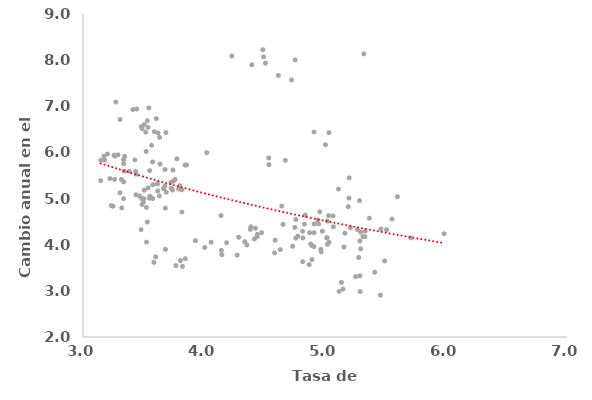
| Category | Cambio anual en el salario |
|---|---|
| 3.636755075451 | 5.747 |
| 3.551407384229 | 5.607 |
| 3.632562846344 | 6.326 |
| 3.566520086992 | 6.155 |
| 3.677917685002 | 5.63 |
| 3.743498910418 | 5.619 |
| 3.575231893725 | 5.793 |
| 3.434788330244 | 5.587 |
| 3.340362617098 | 5.595 |
| 3.260734633069 | 5.416 |
| 3.147302571141 | 5.831 |
| 3.173327092904 | 5.917 |
| 3.202334785867 | 5.964 |
| 3.5218073054139998 | 6.021 |
| 3.335968550554 | 5.363 |
| 3.382289959599 | 5.59 |
| 3.146376340557 | 5.388 |
| 3.506269509183 | 5.182 |
| 3.66525914218 | 5.215 |
| 3.616748951211 | 5.321 |
| 3.727625757521 | 5.353 |
| 3.677396772077 | 5.275 |
| 3.739330443662 | 5.183 |
| 3.790183583541 | 5.207 |
| 3.730108997 | 5.223 |
| 3.816746826182 | 5.189 |
| 3.80054906403 | 5.279 |
| 3.688204571884 | 5.136 |
| 3.465787348674 | 5.055 |
| 3.538455583808 | 5.232 |
| 3.487016914085 | 4.997 |
| 3.576317514046 | 5.001 |
| 3.503364823922 | 4.997 |
| 3.631091459426 | 5.056 |
| 3.55324857923 | 5.052 |
| 3.524255259055 | 4.808 |
| 3.817062512455 | 4.707 |
| 3.680310339228 | 4.791 |
| 3.760275125427 | 5.414 |
| 3.617664159624 | 5.164 |
| 3.576600983859 | 5.3 |
| 3.611667298808 | 5.321 |
| 3.843556222457 | 5.725 |
| 3.776113797965 | 5.862 |
| 3.855476447178 | 5.729 |
| 4.023080548475 | 5.996 |
| 4.536740523036 | 5.735 |
| 4.534791293367 | 5.879 |
| 4.671996861529 | 5.829 |
| 5.003211615659 | 6.168 |
| 4.956673154601 | 4.714 |
| 5.19811802376 | 5.009 |
| 5.598531370192 | 5.04 |
| 5.285655679778 | 4.957 |
| 5.462130923632 | 4.338 |
| 5.709113210652 | 4.149 |
| 5.984429928574 | 4.238 |
| 5.49290958858 | 3.647 |
| 5.28860770517 | 3.325 |
| 5.290374385779 | 2.983 |
| 5.411109539509 | 3.404 |
| 5.116237378877 | 2.99 |
| 5.149484985416 | 3.038 |
| 5.458391086111 | 2.906 |
| 5.253250825102 | 3.309 |
| 5.135948733168 | 3.183 |
| 5.294778583115 | 3.913 |
| 5.015923424539 | 4.154 |
| 5.278618031883 | 3.723 |
| 5.332000275831 | 4.297 |
| 5.313459502735 | 4.177 |
| 5.508987775258 | 4.325 |
| 5.029556328343 | 4.631 |
| 5.267967054631 | 4.329 |
| 5.111592072362 | 5.206 |
| 5.199583906435 | 5.449 |
| 5.367233085946 | 4.573 |
| 5.553838013083 | 4.555 |
| 5.208795585994 | 4.369 |
| 5.288783692502 | 4.082 |
| 5.069578502403 | 4.388 |
| 4.873570411637 | 4.261 |
| 5.065582892949 | 4.625 |
| 5.019365292459 | 4.514 |
| 4.629649584343 | 3.893 |
| 5.294538738583 | 4.278 |
| 5.020894463362 | 4.007 |
| 4.908364963954 | 3.961 |
| 4.775783899051 | 4.187 |
| 4.816791047749 | 4.147 |
| 4.751328891787 | 4.374 |
| 4.939636822335 | 4.536 |
| 4.58821056343 | 4.097 |
| 4.90991886618 | 4.26 |
| 5.156644503712 | 3.949 |
| 4.891907968598 | 3.982 |
| 5.164586634969 | 4.251 |
| 4.814513835867 | 4.29 |
| 4.978154306613 | 4.292 |
| 5.015881883255 | 4.145 |
| 4.967871614648 | 3.847 |
| 5.033443790191 | 4.052 |
| 4.869507377796 | 3.57 |
| 4.815880641791 | 3.632 |
| 4.965227804926 | 3.9 |
| 4.892290914008 | 3.676 |
| 4.583596230228 | 3.823 |
| 4.732163339102 | 3.965 |
| 4.88213822052 | 4.015 |
| 4.758600296909 | 4.143 |
| 5.329997189043 | 4.173 |
| 4.910773638489 | 4.448 |
| 4.947092726046 | 4.45 |
| 4.830182470967 | 4.446 |
| 5.191914614689 | 4.823 |
| 4.837069152081 | 4.642 |
| 4.759057331362 | 4.547 |
| 4.653415457934 | 4.44 |
| 4.642849127441 | 4.837 |
| 4.140762858054 | 4.632 |
| 4.382678334289 | 4.332 |
| 4.438292712358 | 4.174 |
| 4.286888951392 | 4.162 |
| 4.354400340019 | 3.995 |
| 4.425608163968 | 4.357 |
| 4.416725669413 | 4.123 |
| 4.475984849273 | 4.263 |
| 4.387449526565 | 4.388 |
| 4.186908993559 | 4.043 |
| 4.440404296224 | 4.222 |
| 4.058892113814 | 4.053 |
| 4.337122162554 | 4.066 |
| 4.147371063156 | 3.784 |
| 4.273788710107 | 3.775 |
| 4.14337792218 | 3.877 |
| 3.822217183614 | 3.531 |
| 4.005933539106 | 3.941 |
| 3.929109191137 | 4.087 |
| 3.805589529205 | 3.659 |
| 3.768389941351 | 3.547 |
| 3.845669929923 | 3.697 |
| 3.585906417481 | 3.617 |
| 3.600546424524 | 3.738 |
| 3.681421732757 | 3.9 |
| 3.525269827484 | 4.056 |
| 3.47967405922 | 4.326 |
| 3.531495246182 | 4.491 |
| 3.488041413715 | 4.872 |
| 3.548130398367 | 5.008 |
| 3.24728434717 | 4.834 |
| 3.233688887159 | 4.849 |
| 3.319826161832 | 4.796 |
| 3.335184580987 | 4.998 |
| 3.436671438044 | 5.084 |
| 3.498808675082 | 4.923 |
| 3.440306976657 | 5.528 |
| 3.305314475629 | 5.125 |
| 3.317243517262 | 5.416 |
| 3.256450103018 | 5.941 |
| 3.42874841543 | 5.838 |
| 3.222450456902 | 5.434 |
| 3.336629648725 | 5.756 |
| 3.288935625042 | 5.947 |
| 3.263201937873 | 5.92 |
| 3.335066060771 | 5.841 |
| 3.178546604848 | 5.834 |
| 3.343911894121 | 5.914 |
| 3.747173706252 | 5.379 |
| 3.443283046109 | 6.942 |
| 3.412530027204 | 6.931 |
| 3.605424236178 | 6.733 |
| 3.544285254186 | 6.966 |
| 3.531811179145 | 6.688 |
| 3.48134383688 | 6.557 |
| 3.48843411707 | 6.515 |
| 3.505990224856 | 6.604 |
| 3.518185903889 | 6.44 |
| 3.589263075913 | 6.447 |
| 3.537178136291 | 6.542 |
| 3.306722209428 | 6.713 |
| 3.620080203888 | 6.421 |
| 3.685131244491 | 6.431 |
| 3.270919273084 | 7.092 |
| 4.752961537568 | 8.005 |
| 4.229822907557 | 8.088 |
| 5.320834514096 | 8.137 |
| 5.032699914332 | 6.43 |
| 4.909474451912 | 6.442 |
| 4.723730102758 | 7.573 |
| 4.614652533956 | 7.667 |
| 4.507934480135 | 7.936 |
| 4.395503645327 | 7.9 |
| 4.486328249782 | 8.227 |
| 4.492174686135 | 8.07 |